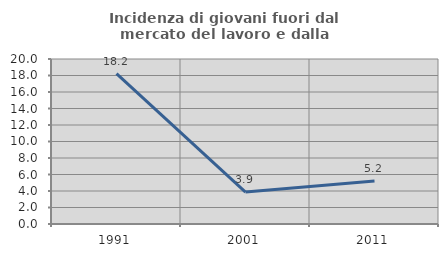
| Category | Incidenza di giovani fuori dal mercato del lavoro e dalla formazione  |
|---|---|
| 1991.0 | 18.235 |
| 2001.0 | 3.876 |
| 2011.0 | 5.208 |